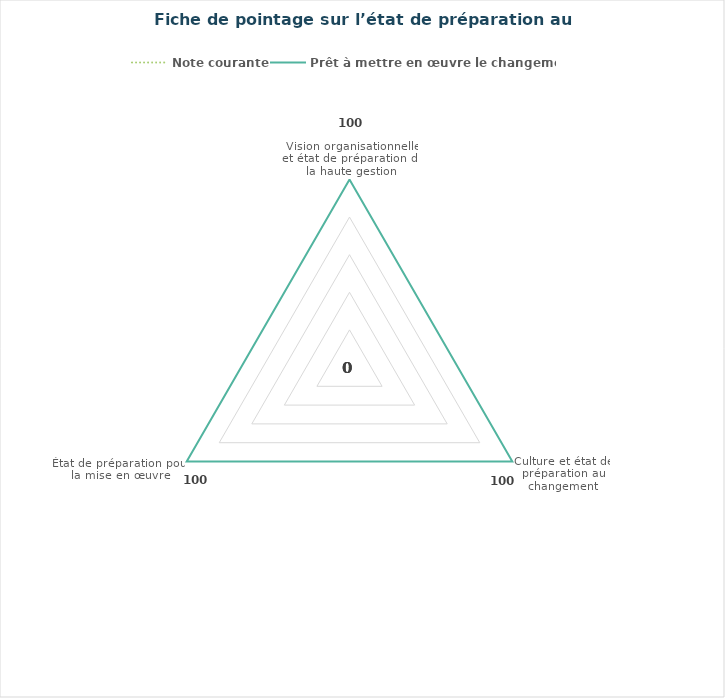
| Category | Note courante | Prêt à mettre en œuvre le changement |
|---|---|---|
| Vision organisationnelle et état de préparation de la haute gestion | 0 | 100 |
| Culture et état de préparation au changement | 0 | 100 |
| État de préparation pour la mise en œuvre | 0 | 100 |